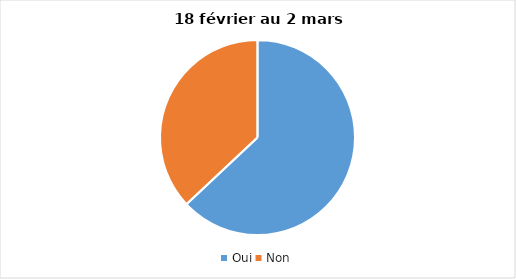
| Category | Series 0 |
|---|---|
| Oui | 63 |
| Non | 37 |